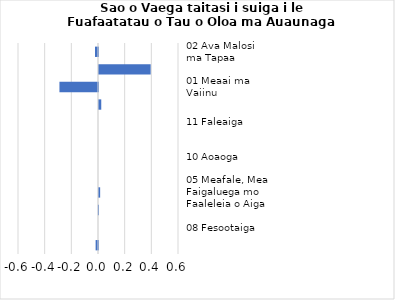
| Category |     Contributions |
|---|---|
| 02 Ava Malosi ma Tapaa | -0.023 |
| 07 Femalagaiga | 0.387 |
| 01 Meaai ma Vaiinu | -0.289 |
| 04 Fale, Suavai, Eletise, Kesi ma isi | 0.017 |
| 11 Faleaiga | 0 |
| 09 Faafiafiaga ma Aganuu | 0 |
| 10 Aoaoga | 0 |
| 06 Soifua Maloloina | 0 |
| 05 Meafale, Mea Faigaluega mo Faaleleia o Aiga | 0.009 |
| 03 Lavalava ma Seevae | -0.001 |
| 08 Fesootaiga | 0 |
| 12 Isi Oloa ma Auaunaga | -0.018 |